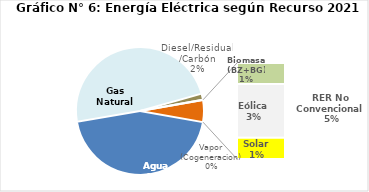
| Category | Series 0 |
|---|---|
| Agua | 2111.461 |
| Gas Natural | 2292.785 |
| Diesel/Residual/Carbón | 74.871 |
| Vapor (Cogeneracion) | 0.205 |
| Biomasa (BZ+BG) | 57.759 |
| Eólica | 147.897 |
| Solar | 58.635 |